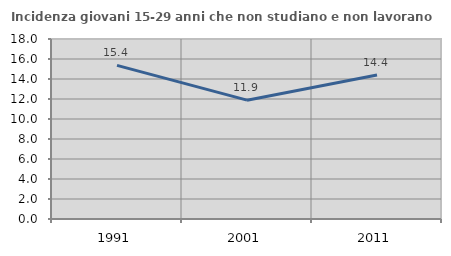
| Category | Incidenza giovani 15-29 anni che non studiano e non lavorano  |
|---|---|
| 1991.0 | 15.361 |
| 2001.0 | 11.883 |
| 2011.0 | 14.404 |